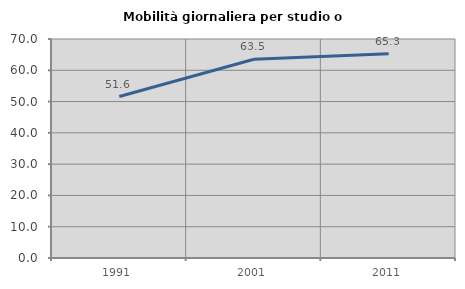
| Category | Mobilità giornaliera per studio o lavoro |
|---|---|
| 1991.0 | 51.615 |
| 2001.0 | 63.512 |
| 2011.0 | 65.314 |